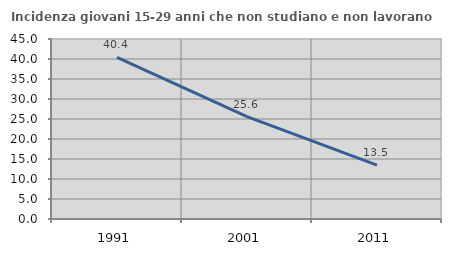
| Category | Incidenza giovani 15-29 anni che non studiano e non lavorano  |
|---|---|
| 1991.0 | 40.39 |
| 2001.0 | 25.606 |
| 2011.0 | 13.469 |